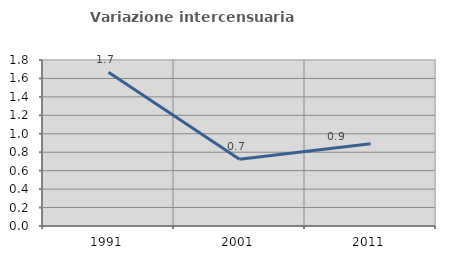
| Category | Variazione intercensuaria annua |
|---|---|
| 1991.0 | 1.668 |
| 2001.0 | 0.725 |
| 2011.0 | 0.892 |